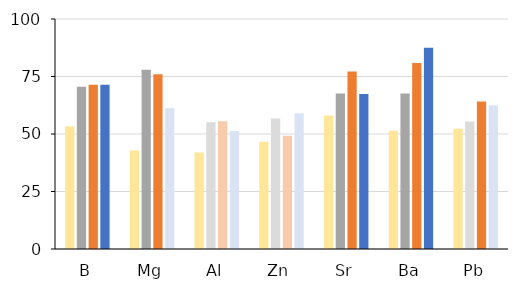
| Category | FO | IOM | ICE | GOM |
|---|---|---|---|---|
| B | 53.333 | 70.588 | 71.429 | 71.429 |
| Mg | 42.857 | 77.941 | 75.926 | 61.224 |
| Al | 41.905 | 55.128 | 55.556 | 51.282 |
| Zn | 46.667 | 56.757 | 49.254 | 58.974 |
| Sr | 58.095 | 67.568 | 77.193 | 67.347 |
| Ba | 51.429 | 67.647 | 80.864 | 87.5 |
| Pb | 52.294 | 55.405 | 64.179 | 62.5 |